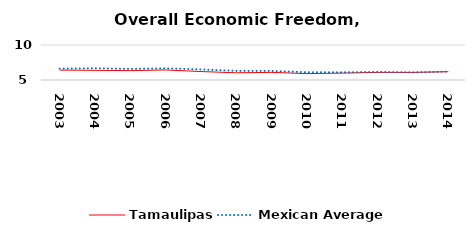
| Category | Tamaulipas | Mexican Average  |
|---|---|---|
| 2003.0 | 6.416 | 6.632 |
| 2004.0 | 6.379 | 6.678 |
| 2005.0 | 6.338 | 6.582 |
| 2006.0 | 6.433 | 6.668 |
| 2007.0 | 6.207 | 6.508 |
| 2008.0 | 6.03 | 6.3 |
| 2009.0 | 6.091 | 6.3 |
| 2010.0 | 5.912 | 6.105 |
| 2011.0 | 5.986 | 6.103 |
| 2012.0 | 6.089 | 6.144 |
| 2013.0 | 6.083 | 6.087 |
| 2014.0 | 6.187 | 6.195 |